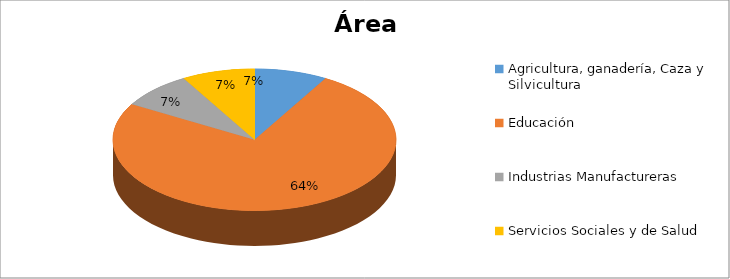
| Category | Series 0 |
|---|---|
| Agricultura, ganadería, Caza y Silvicultura | 0.071 |
| Educación | 0.643 |
| Industrias Manufactureras | 0.071 |
| Servicios Sociales y de Salud | 0.071 |